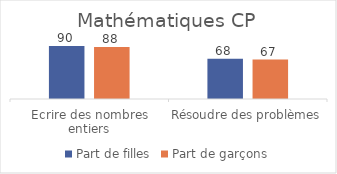
| Category | Part de filles | Part de garçons |
|---|---|---|
| Ecrire des nombres entiers | 89.98 | 88.2 |
| Résoudre des problèmes | 68.16 | 66.89 |